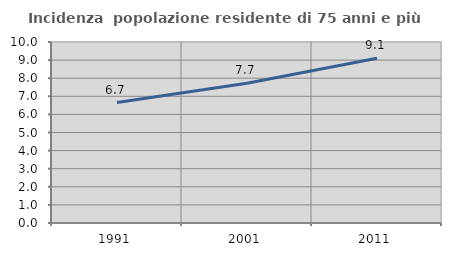
| Category | Incidenza  popolazione residente di 75 anni e più |
|---|---|
| 1991.0 | 6.654 |
| 2001.0 | 7.721 |
| 2011.0 | 9.106 |